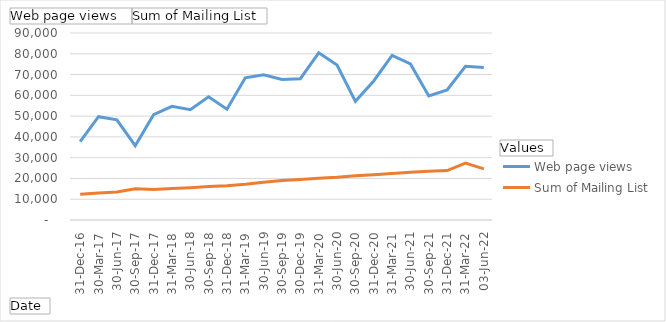
| Category | Web page views  | Sum of Mailing List |
|---|---|---|
| 31-Dec-16 | 37669 | 12348 |
| 30-Mar-17 | 49730 | 13039 |
| 30-Jun-17 | 48242 | 13463 |
| 30-Sep-17 | 35780 | 14981 |
| 31-Dec-17 | 50705 | 14629 |
| 31-Mar-18 | 54689 | 15174 |
| 30-Jun-18 | 53046 | 15546 |
| 30-Sep-18 | 59278 | 16102 |
| 31-Dec-18 | 53339 | 16456 |
| 31-Mar-19 | 68455 | 17221 |
| 30-Jun-19 | 69888 | 18192 |
| 30-Sep-19 | 67662 | 18983 |
| 30-Dec-19 | 68019 | 19470 |
| 31-Mar-20 | 80472 | 20092 |
| 30-Jun-20 | 74564 | 20572 |
| 30-Sep-20 | 57126 | 21284 |
| 31-Dec-20 | 66908 | 21814 |
| 31-Mar-21 | 79239 | 22397 |
| 30-Jun-21 | 75123 | 22926 |
| 30-Sep-21 | 59676 | 23439 |
| 31-Dec-21 | 62617 | 23776 |
| 31-Mar-22 | 73977 | 27348 |
| 03-Jun-22 | 73449 | 24598 |